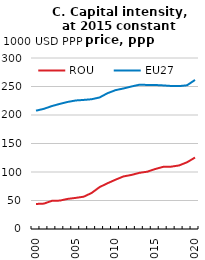
| Category | ROU | EU27 |
|---|---|---|
| 2000.0 | 43.891 | 207.577 |
| 2001.0 | 44.562 | 210.845 |
| 2002.0 | 49.398 | 215.681 |
| 2003.0 | 49.834 | 219.514 |
| 2004.0 | 52.844 | 222.945 |
| 2005.0 | 54.606 | 225.491 |
| 2006.0 | 56.673 | 226.463 |
| 2007.0 | 63.232 | 227.648 |
| 2008.0 | 73.522 | 230.792 |
| 2009.0 | 80.255 | 238.242 |
| 2010.0 | 86.48 | 243.578 |
| 2011.0 | 92.231 | 246.542 |
| 2012.0 | 94.832 | 250.002 |
| 2013.0 | 98.527 | 253.111 |
| 2014.0 | 100.554 | 252.758 |
| 2015.0 | 105.235 | 252.643 |
| 2016.0 | 109.076 | 251.897 |
| 2017.0 | 109.381 | 250.934 |
| 2018.0 | 111.527 | 250.664 |
| 2019.0 | 117.081 | 252.174 |
| 2020.0 | 125.362 | 261.57 |